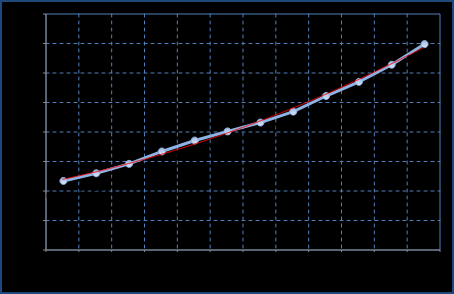
| Category | Series 0 |
|---|---|
| Jan 15 | 63.17 |
| Feb 15 | 63.3 |
| Mar 15 | 63.46 |
| Apr 15 | 63.67 |
| May 15 | 63.855 |
| Jun 15 | 64.01 |
| Jul 15 | 64.16 |
| Aug 15 | 64.345 |
| Sep 15 | 64.61 |
| Oct 15 | 64.85 |
| Nov 15 | 65.14 |
| Dec 15 | 65.49 |